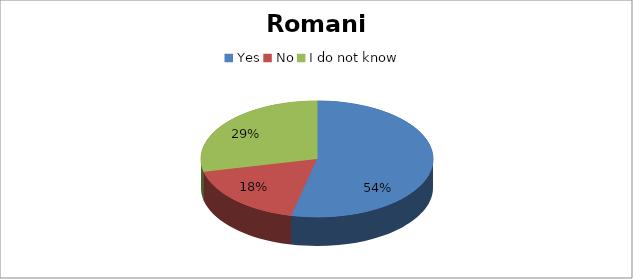
| Category | Series 0 |
|---|---|
| Yes | 60 |
| No | 20 |
| I do not know | 32 |